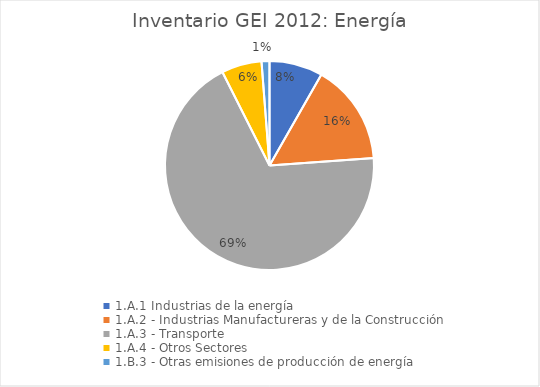
| Category | Series 0 |
|---|---|
| 1.A.1 Industrias de la energía | 595.24 |
| 1.A.2 - Industrias Manufactureras y de la Construcción | 1125.31 |
| 1.A.3 - Transporte | 4955.69 |
| 1.A.4 - Otros Sectores | 447.69 |
| 1.B.3 - Otras emisiones de producción de energía | 88.16 |